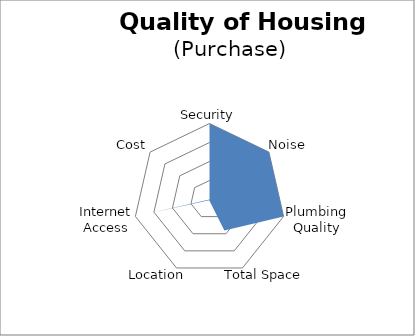
| Category | Series 0 |
|---|---|
| Security | 100 |
| Noise | 100 |
| Plumbing Quality | 100 |
| Total Space | 45.119 |
| Location | 0.928 |
| Internet Access | 81.441 |
| Cost | 0 |